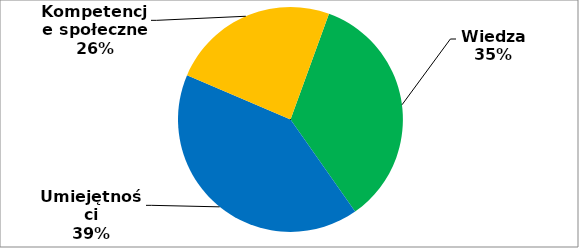
| Category | Series 0 |
|---|---|
| 0 | 59 |
| 1 | 70 |
| 2 | 41 |